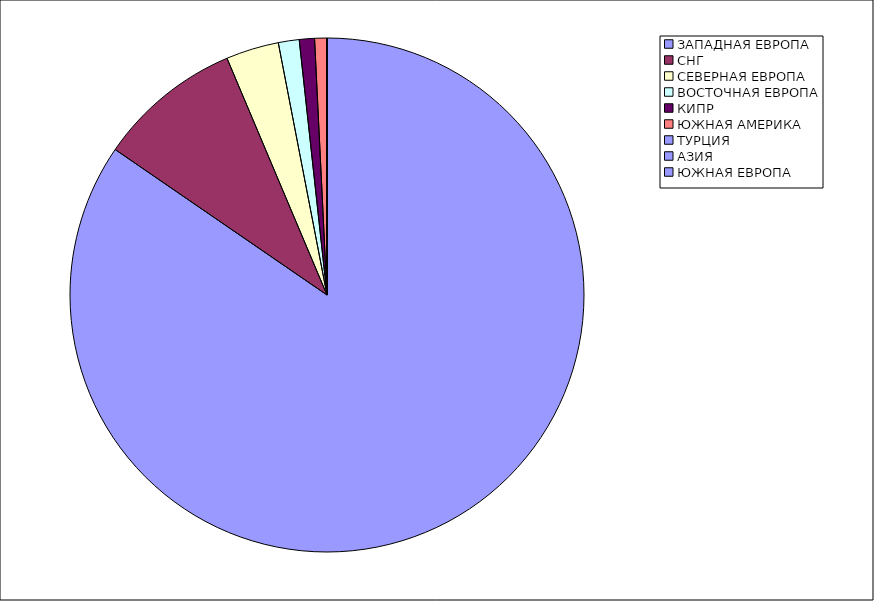
| Category | Оборот |
|---|---|
| ЗАПАДНАЯ ЕВРОПА | 0.846 |
| СНГ | 0.091 |
| СЕВЕРНАЯ ЕВРОПА | 0.033 |
| ВОСТОЧНАЯ ЕВРОПА | 0.013 |
| КИПР | 0.01 |
| ЮЖНАЯ АМЕРИКА | 0.007 |
| ТУРЦИЯ | 0 |
| АЗИЯ | 0 |
| ЮЖНАЯ ЕВРОПА | 0 |